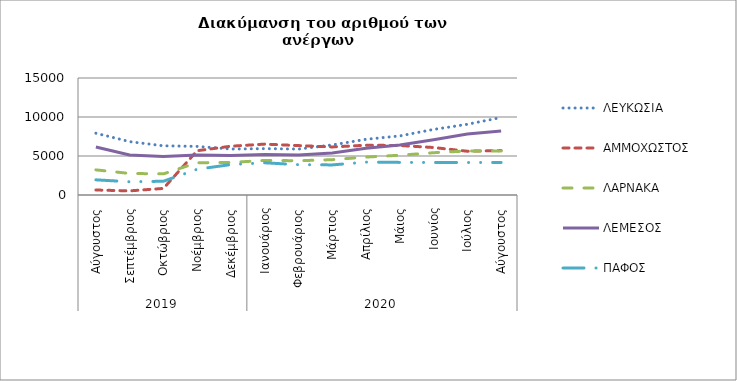
| Category | ΛΕΥΚΩΣΙΑ | ΑΜΜΟΧΩΣΤΟΣ | ΛΑΡΝΑΚΑ | ΛΕΜΕΣΟΣ | ΠΑΦΟΣ |
|---|---|---|---|---|---|
| 0 | 7922 | 641 | 3223 | 6153 | 1944 |
| 1 | 6840 | 529 | 2762 | 5139 | 1697 |
| 2 | 6306 | 843 | 2710 | 4922 | 1763 |
| 3 | 6231 | 5679 | 4139 | 5142 | 3304 |
| 4 | 5893 | 6256 | 4171 | 5061 | 3904 |
| 5 | 5943 | 6524 | 4433 | 5185 | 4129 |
| 6 | 5890 | 6335 | 4394 | 5114 | 3887 |
| 7 | 6416 | 6162 | 4527 | 5390 | 3858 |
| 8 | 7143 | 6380 | 4862 | 5992 | 4214 |
| 9 | 7576 | 6346 | 5099 | 6402 | 4181 |
| 10 | 8407 | 6088 | 5421 | 7072 | 4170 |
| 11 | 9066 | 5611 | 5646 | 7825 | 4165 |
| 12 | 9937 | 5694 | 5640 | 8215 | 4163 |